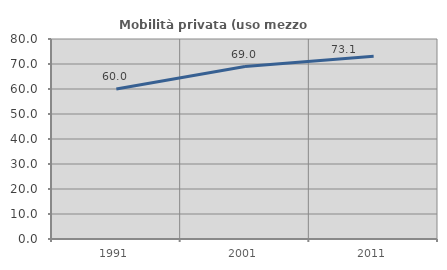
| Category | Mobilità privata (uso mezzo privato) |
|---|---|
| 1991.0 | 60.014 |
| 2001.0 | 68.963 |
| 2011.0 | 73.112 |